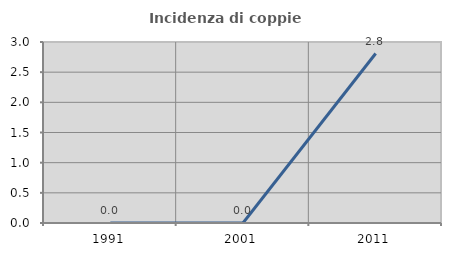
| Category | Incidenza di coppie miste |
|---|---|
| 1991.0 | 0 |
| 2001.0 | 0 |
| 2011.0 | 2.809 |